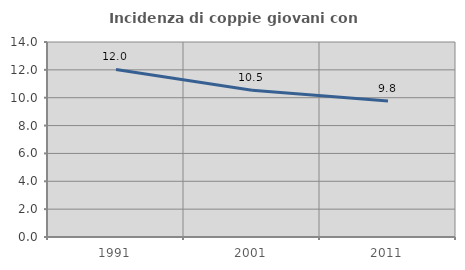
| Category | Incidenza di coppie giovani con figli |
|---|---|
| 1991.0 | 12.027 |
| 2001.0 | 10.543 |
| 2011.0 | 9.772 |